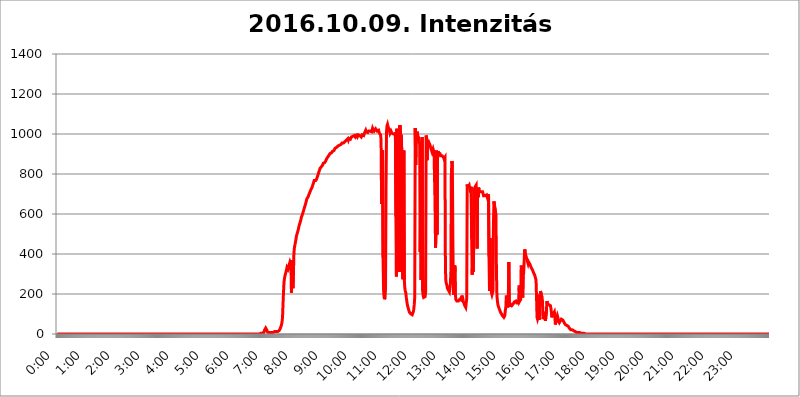
| Category | 2016.10.09. Intenzitás [W/m^2] |
|---|---|
| 0.0 | 0 |
| 0.0006944444444444445 | 0 |
| 0.001388888888888889 | 0 |
| 0.0020833333333333333 | 0 |
| 0.002777777777777778 | 0 |
| 0.003472222222222222 | 0 |
| 0.004166666666666667 | 0 |
| 0.004861111111111111 | 0 |
| 0.005555555555555556 | 0 |
| 0.0062499999999999995 | 0 |
| 0.006944444444444444 | 0 |
| 0.007638888888888889 | 0 |
| 0.008333333333333333 | 0 |
| 0.009027777777777779 | 0 |
| 0.009722222222222222 | 0 |
| 0.010416666666666666 | 0 |
| 0.011111111111111112 | 0 |
| 0.011805555555555555 | 0 |
| 0.012499999999999999 | 0 |
| 0.013194444444444444 | 0 |
| 0.013888888888888888 | 0 |
| 0.014583333333333332 | 0 |
| 0.015277777777777777 | 0 |
| 0.015972222222222224 | 0 |
| 0.016666666666666666 | 0 |
| 0.017361111111111112 | 0 |
| 0.018055555555555557 | 0 |
| 0.01875 | 0 |
| 0.019444444444444445 | 0 |
| 0.02013888888888889 | 0 |
| 0.020833333333333332 | 0 |
| 0.02152777777777778 | 0 |
| 0.022222222222222223 | 0 |
| 0.02291666666666667 | 0 |
| 0.02361111111111111 | 0 |
| 0.024305555555555556 | 0 |
| 0.024999999999999998 | 0 |
| 0.025694444444444447 | 0 |
| 0.02638888888888889 | 0 |
| 0.027083333333333334 | 0 |
| 0.027777777777777776 | 0 |
| 0.02847222222222222 | 0 |
| 0.029166666666666664 | 0 |
| 0.029861111111111113 | 0 |
| 0.030555555555555555 | 0 |
| 0.03125 | 0 |
| 0.03194444444444445 | 0 |
| 0.03263888888888889 | 0 |
| 0.03333333333333333 | 0 |
| 0.034027777777777775 | 0 |
| 0.034722222222222224 | 0 |
| 0.035416666666666666 | 0 |
| 0.036111111111111115 | 0 |
| 0.03680555555555556 | 0 |
| 0.0375 | 0 |
| 0.03819444444444444 | 0 |
| 0.03888888888888889 | 0 |
| 0.03958333333333333 | 0 |
| 0.04027777777777778 | 0 |
| 0.04097222222222222 | 0 |
| 0.041666666666666664 | 0 |
| 0.042361111111111106 | 0 |
| 0.04305555555555556 | 0 |
| 0.043750000000000004 | 0 |
| 0.044444444444444446 | 0 |
| 0.04513888888888889 | 0 |
| 0.04583333333333334 | 0 |
| 0.04652777777777778 | 0 |
| 0.04722222222222222 | 0 |
| 0.04791666666666666 | 0 |
| 0.04861111111111111 | 0 |
| 0.049305555555555554 | 0 |
| 0.049999999999999996 | 0 |
| 0.05069444444444445 | 0 |
| 0.051388888888888894 | 0 |
| 0.052083333333333336 | 0 |
| 0.05277777777777778 | 0 |
| 0.05347222222222222 | 0 |
| 0.05416666666666667 | 0 |
| 0.05486111111111111 | 0 |
| 0.05555555555555555 | 0 |
| 0.05625 | 0 |
| 0.05694444444444444 | 0 |
| 0.057638888888888885 | 0 |
| 0.05833333333333333 | 0 |
| 0.05902777777777778 | 0 |
| 0.059722222222222225 | 0 |
| 0.06041666666666667 | 0 |
| 0.061111111111111116 | 0 |
| 0.06180555555555556 | 0 |
| 0.0625 | 0 |
| 0.06319444444444444 | 0 |
| 0.06388888888888888 | 0 |
| 0.06458333333333334 | 0 |
| 0.06527777777777778 | 0 |
| 0.06597222222222222 | 0 |
| 0.06666666666666667 | 0 |
| 0.06736111111111111 | 0 |
| 0.06805555555555555 | 0 |
| 0.06874999999999999 | 0 |
| 0.06944444444444443 | 0 |
| 0.07013888888888889 | 0 |
| 0.07083333333333333 | 0 |
| 0.07152777777777779 | 0 |
| 0.07222222222222223 | 0 |
| 0.07291666666666667 | 0 |
| 0.07361111111111111 | 0 |
| 0.07430555555555556 | 0 |
| 0.075 | 0 |
| 0.07569444444444444 | 0 |
| 0.0763888888888889 | 0 |
| 0.07708333333333334 | 0 |
| 0.07777777777777778 | 0 |
| 0.07847222222222222 | 0 |
| 0.07916666666666666 | 0 |
| 0.0798611111111111 | 0 |
| 0.08055555555555556 | 0 |
| 0.08125 | 0 |
| 0.08194444444444444 | 0 |
| 0.08263888888888889 | 0 |
| 0.08333333333333333 | 0 |
| 0.08402777777777777 | 0 |
| 0.08472222222222221 | 0 |
| 0.08541666666666665 | 0 |
| 0.08611111111111112 | 0 |
| 0.08680555555555557 | 0 |
| 0.08750000000000001 | 0 |
| 0.08819444444444445 | 0 |
| 0.08888888888888889 | 0 |
| 0.08958333333333333 | 0 |
| 0.09027777777777778 | 0 |
| 0.09097222222222222 | 0 |
| 0.09166666666666667 | 0 |
| 0.09236111111111112 | 0 |
| 0.09305555555555556 | 0 |
| 0.09375 | 0 |
| 0.09444444444444444 | 0 |
| 0.09513888888888888 | 0 |
| 0.09583333333333333 | 0 |
| 0.09652777777777777 | 0 |
| 0.09722222222222222 | 0 |
| 0.09791666666666667 | 0 |
| 0.09861111111111111 | 0 |
| 0.09930555555555555 | 0 |
| 0.09999999999999999 | 0 |
| 0.10069444444444443 | 0 |
| 0.1013888888888889 | 0 |
| 0.10208333333333335 | 0 |
| 0.10277777777777779 | 0 |
| 0.10347222222222223 | 0 |
| 0.10416666666666667 | 0 |
| 0.10486111111111111 | 0 |
| 0.10555555555555556 | 0 |
| 0.10625 | 0 |
| 0.10694444444444444 | 0 |
| 0.1076388888888889 | 0 |
| 0.10833333333333334 | 0 |
| 0.10902777777777778 | 0 |
| 0.10972222222222222 | 0 |
| 0.1111111111111111 | 0 |
| 0.11180555555555556 | 0 |
| 0.11180555555555556 | 0 |
| 0.1125 | 0 |
| 0.11319444444444444 | 0 |
| 0.11388888888888889 | 0 |
| 0.11458333333333333 | 0 |
| 0.11527777777777777 | 0 |
| 0.11597222222222221 | 0 |
| 0.11666666666666665 | 0 |
| 0.1173611111111111 | 0 |
| 0.11805555555555557 | 0 |
| 0.11944444444444445 | 0 |
| 0.12013888888888889 | 0 |
| 0.12083333333333333 | 0 |
| 0.12152777777777778 | 0 |
| 0.12222222222222223 | 0 |
| 0.12291666666666667 | 0 |
| 0.12291666666666667 | 0 |
| 0.12361111111111112 | 0 |
| 0.12430555555555556 | 0 |
| 0.125 | 0 |
| 0.12569444444444444 | 0 |
| 0.12638888888888888 | 0 |
| 0.12708333333333333 | 0 |
| 0.16875 | 0 |
| 0.12847222222222224 | 0 |
| 0.12916666666666668 | 0 |
| 0.12986111111111112 | 0 |
| 0.13055555555555556 | 0 |
| 0.13125 | 0 |
| 0.13194444444444445 | 0 |
| 0.1326388888888889 | 0 |
| 0.13333333333333333 | 0 |
| 0.13402777777777777 | 0 |
| 0.13402777777777777 | 0 |
| 0.13472222222222222 | 0 |
| 0.13541666666666666 | 0 |
| 0.1361111111111111 | 0 |
| 0.13749999999999998 | 0 |
| 0.13819444444444443 | 0 |
| 0.1388888888888889 | 0 |
| 0.13958333333333334 | 0 |
| 0.14027777777777778 | 0 |
| 0.14097222222222222 | 0 |
| 0.14166666666666666 | 0 |
| 0.1423611111111111 | 0 |
| 0.14305555555555557 | 0 |
| 0.14375000000000002 | 0 |
| 0.14444444444444446 | 0 |
| 0.1451388888888889 | 0 |
| 0.1451388888888889 | 0 |
| 0.14652777777777778 | 0 |
| 0.14722222222222223 | 0 |
| 0.14791666666666667 | 0 |
| 0.1486111111111111 | 0 |
| 0.14930555555555555 | 0 |
| 0.15 | 0 |
| 0.15069444444444444 | 0 |
| 0.15138888888888888 | 0 |
| 0.15208333333333332 | 0 |
| 0.15277777777777776 | 0 |
| 0.15347222222222223 | 0 |
| 0.15416666666666667 | 0 |
| 0.15486111111111112 | 0 |
| 0.15555555555555556 | 0 |
| 0.15625 | 0 |
| 0.15694444444444444 | 0 |
| 0.15763888888888888 | 0 |
| 0.15833333333333333 | 0 |
| 0.15902777777777777 | 0 |
| 0.15972222222222224 | 0 |
| 0.16041666666666668 | 0 |
| 0.16111111111111112 | 0 |
| 0.16180555555555556 | 0 |
| 0.1625 | 0 |
| 0.16319444444444445 | 0 |
| 0.1638888888888889 | 0 |
| 0.16458333333333333 | 0 |
| 0.16527777777777777 | 0 |
| 0.16597222222222222 | 0 |
| 0.16666666666666666 | 0 |
| 0.1673611111111111 | 0 |
| 0.16805555555555554 | 0 |
| 0.16874999999999998 | 0 |
| 0.16944444444444443 | 0 |
| 0.17013888888888887 | 0 |
| 0.1708333333333333 | 0 |
| 0.17152777777777775 | 0 |
| 0.17222222222222225 | 0 |
| 0.1729166666666667 | 0 |
| 0.17361111111111113 | 0 |
| 0.17430555555555557 | 0 |
| 0.17500000000000002 | 0 |
| 0.17569444444444446 | 0 |
| 0.1763888888888889 | 0 |
| 0.17708333333333334 | 0 |
| 0.17777777777777778 | 0 |
| 0.17847222222222223 | 0 |
| 0.17916666666666667 | 0 |
| 0.1798611111111111 | 0 |
| 0.18055555555555555 | 0 |
| 0.18125 | 0 |
| 0.18194444444444444 | 0 |
| 0.1826388888888889 | 0 |
| 0.18333333333333335 | 0 |
| 0.1840277777777778 | 0 |
| 0.18472222222222223 | 0 |
| 0.18541666666666667 | 0 |
| 0.18611111111111112 | 0 |
| 0.18680555555555556 | 0 |
| 0.1875 | 0 |
| 0.18819444444444444 | 0 |
| 0.18888888888888888 | 0 |
| 0.18958333333333333 | 0 |
| 0.19027777777777777 | 0 |
| 0.1909722222222222 | 0 |
| 0.19166666666666665 | 0 |
| 0.19236111111111112 | 0 |
| 0.19305555555555554 | 0 |
| 0.19375 | 0 |
| 0.19444444444444445 | 0 |
| 0.1951388888888889 | 0 |
| 0.19583333333333333 | 0 |
| 0.19652777777777777 | 0 |
| 0.19722222222222222 | 0 |
| 0.19791666666666666 | 0 |
| 0.1986111111111111 | 0 |
| 0.19930555555555554 | 0 |
| 0.19999999999999998 | 0 |
| 0.20069444444444443 | 0 |
| 0.20138888888888887 | 0 |
| 0.2020833333333333 | 0 |
| 0.2027777777777778 | 0 |
| 0.2034722222222222 | 0 |
| 0.2041666666666667 | 0 |
| 0.20486111111111113 | 0 |
| 0.20555555555555557 | 0 |
| 0.20625000000000002 | 0 |
| 0.20694444444444446 | 0 |
| 0.2076388888888889 | 0 |
| 0.20833333333333334 | 0 |
| 0.20902777777777778 | 0 |
| 0.20972222222222223 | 0 |
| 0.21041666666666667 | 0 |
| 0.2111111111111111 | 0 |
| 0.21180555555555555 | 0 |
| 0.2125 | 0 |
| 0.21319444444444444 | 0 |
| 0.2138888888888889 | 0 |
| 0.21458333333333335 | 0 |
| 0.2152777777777778 | 0 |
| 0.21597222222222223 | 0 |
| 0.21666666666666667 | 0 |
| 0.21736111111111112 | 0 |
| 0.21805555555555556 | 0 |
| 0.21875 | 0 |
| 0.21944444444444444 | 0 |
| 0.22013888888888888 | 0 |
| 0.22083333333333333 | 0 |
| 0.22152777777777777 | 0 |
| 0.2222222222222222 | 0 |
| 0.22291666666666665 | 0 |
| 0.2236111111111111 | 0 |
| 0.22430555555555556 | 0 |
| 0.225 | 0 |
| 0.22569444444444445 | 0 |
| 0.2263888888888889 | 0 |
| 0.22708333333333333 | 0 |
| 0.22777777777777777 | 0 |
| 0.22847222222222222 | 0 |
| 0.22916666666666666 | 0 |
| 0.2298611111111111 | 0 |
| 0.23055555555555554 | 0 |
| 0.23124999999999998 | 0 |
| 0.23194444444444443 | 0 |
| 0.23263888888888887 | 0 |
| 0.2333333333333333 | 0 |
| 0.2340277777777778 | 0 |
| 0.2347222222222222 | 0 |
| 0.2354166666666667 | 0 |
| 0.23611111111111113 | 0 |
| 0.23680555555555557 | 0 |
| 0.23750000000000002 | 0 |
| 0.23819444444444446 | 0 |
| 0.2388888888888889 | 0 |
| 0.23958333333333334 | 0 |
| 0.24027777777777778 | 0 |
| 0.24097222222222223 | 0 |
| 0.24166666666666667 | 0 |
| 0.2423611111111111 | 0 |
| 0.24305555555555555 | 0 |
| 0.24375 | 0 |
| 0.24444444444444446 | 0 |
| 0.24513888888888888 | 0 |
| 0.24583333333333335 | 0 |
| 0.2465277777777778 | 0 |
| 0.24722222222222223 | 0 |
| 0.24791666666666667 | 0 |
| 0.24861111111111112 | 0 |
| 0.24930555555555556 | 0 |
| 0.25 | 0 |
| 0.25069444444444444 | 0 |
| 0.2513888888888889 | 0 |
| 0.2520833333333333 | 0 |
| 0.25277777777777777 | 0 |
| 0.2534722222222222 | 0 |
| 0.25416666666666665 | 0 |
| 0.2548611111111111 | 0 |
| 0.2555555555555556 | 0 |
| 0.25625000000000003 | 0 |
| 0.2569444444444445 | 0 |
| 0.2576388888888889 | 0 |
| 0.25833333333333336 | 0 |
| 0.2590277777777778 | 0 |
| 0.25972222222222224 | 0 |
| 0.2604166666666667 | 0 |
| 0.2611111111111111 | 0 |
| 0.26180555555555557 | 0 |
| 0.2625 | 0 |
| 0.26319444444444445 | 0 |
| 0.2638888888888889 | 0 |
| 0.26458333333333334 | 0 |
| 0.2652777777777778 | 0 |
| 0.2659722222222222 | 0 |
| 0.26666666666666666 | 0 |
| 0.2673611111111111 | 0 |
| 0.26805555555555555 | 0 |
| 0.26875 | 0 |
| 0.26944444444444443 | 0 |
| 0.2701388888888889 | 0 |
| 0.2708333333333333 | 0 |
| 0.27152777777777776 | 0 |
| 0.2722222222222222 | 0 |
| 0.27291666666666664 | 0 |
| 0.2736111111111111 | 0 |
| 0.2743055555555555 | 0 |
| 0.27499999999999997 | 0 |
| 0.27569444444444446 | 0 |
| 0.27638888888888885 | 0 |
| 0.27708333333333335 | 0 |
| 0.2777777777777778 | 0 |
| 0.27847222222222223 | 0 |
| 0.2791666666666667 | 0 |
| 0.2798611111111111 | 0 |
| 0.28055555555555556 | 0 |
| 0.28125 | 0 |
| 0.28194444444444444 | 0 |
| 0.2826388888888889 | 0 |
| 0.2833333333333333 | 0 |
| 0.28402777777777777 | 0 |
| 0.2847222222222222 | 3.525 |
| 0.28541666666666665 | 3.525 |
| 0.28611111111111115 | 3.525 |
| 0.28680555555555554 | 3.525 |
| 0.28750000000000003 | 3.525 |
| 0.2881944444444445 | 3.525 |
| 0.2888888888888889 | 7.887 |
| 0.28958333333333336 | 7.887 |
| 0.2902777777777778 | 12.257 |
| 0.29097222222222224 | 21.024 |
| 0.2916666666666667 | 25.419 |
| 0.2923611111111111 | 29.823 |
| 0.29305555555555557 | 29.823 |
| 0.29375 | 21.024 |
| 0.29444444444444445 | 12.257 |
| 0.2951388888888889 | 7.887 |
| 0.29583333333333334 | 7.887 |
| 0.2965277777777778 | 7.887 |
| 0.2972222222222222 | 7.887 |
| 0.29791666666666666 | 7.887 |
| 0.2986111111111111 | 7.887 |
| 0.29930555555555555 | 7.887 |
| 0.3 | 7.887 |
| 0.30069444444444443 | 7.887 |
| 0.3013888888888889 | 7.887 |
| 0.3020833333333333 | 7.887 |
| 0.30277777777777776 | 7.887 |
| 0.3034722222222222 | 12.257 |
| 0.30416666666666664 | 12.257 |
| 0.3048611111111111 | 12.257 |
| 0.3055555555555555 | 12.257 |
| 0.30624999999999997 | 12.257 |
| 0.3069444444444444 | 12.257 |
| 0.3076388888888889 | 12.257 |
| 0.30833333333333335 | 12.257 |
| 0.3090277777777778 | 12.257 |
| 0.30972222222222223 | 16.636 |
| 0.3104166666666667 | 16.636 |
| 0.3111111111111111 | 16.636 |
| 0.31180555555555556 | 21.024 |
| 0.3125 | 25.419 |
| 0.31319444444444444 | 29.823 |
| 0.3138888888888889 | 38.653 |
| 0.3145833333333333 | 47.511 |
| 0.31527777777777777 | 60.85 |
| 0.3159722222222222 | 83.205 |
| 0.31666666666666665 | 150.964 |
| 0.31736111111111115 | 210.182 |
| 0.31805555555555554 | 260.373 |
| 0.31875000000000003 | 278.603 |
| 0.3194444444444445 | 292.259 |
| 0.3201388888888889 | 296.808 |
| 0.32083333333333336 | 310.44 |
| 0.3215277777777778 | 314.98 |
| 0.32222222222222224 | 333.113 |
| 0.3229166666666667 | 333.113 |
| 0.3236111111111111 | 324.052 |
| 0.32430555555555557 | 324.052 |
| 0.325 | 342.162 |
| 0.32569444444444445 | 351.198 |
| 0.3263888888888889 | 360.221 |
| 0.32708333333333334 | 364.728 |
| 0.3277777777777778 | 346.682 |
| 0.3284722222222222 | 205.62 |
| 0.32916666666666666 | 369.23 |
| 0.3298611111111111 | 274.047 |
| 0.33055555555555555 | 228.436 |
| 0.33125 | 301.354 |
| 0.33194444444444443 | 405.108 |
| 0.3326388888888889 | 431.833 |
| 0.3333333333333333 | 445.129 |
| 0.3340277777777778 | 458.38 |
| 0.3347222222222222 | 471.582 |
| 0.3354166666666667 | 489.108 |
| 0.3361111111111111 | 497.836 |
| 0.3368055555555556 | 502.192 |
| 0.33749999999999997 | 515.223 |
| 0.33819444444444446 | 523.88 |
| 0.33888888888888885 | 536.82 |
| 0.33958333333333335 | 541.121 |
| 0.34027777777777773 | 553.986 |
| 0.34097222222222223 | 562.53 |
| 0.3416666666666666 | 571.049 |
| 0.3423611111111111 | 583.779 |
| 0.3430555555555555 | 588.009 |
| 0.34375 | 596.45 |
| 0.3444444444444445 | 604.864 |
| 0.3451388888888889 | 613.252 |
| 0.3458333333333334 | 621.613 |
| 0.34652777777777777 | 629.948 |
| 0.34722222222222227 | 638.256 |
| 0.34791666666666665 | 642.4 |
| 0.34861111111111115 | 654.791 |
| 0.34930555555555554 | 658.909 |
| 0.35000000000000003 | 675.311 |
| 0.3506944444444444 | 671.22 |
| 0.3513888888888889 | 679.395 |
| 0.3520833333333333 | 687.544 |
| 0.3527777777777778 | 695.666 |
| 0.3534722222222222 | 699.717 |
| 0.3541666666666667 | 707.8 |
| 0.3548611111111111 | 711.832 |
| 0.35555555555555557 | 719.877 |
| 0.35625 | 719.877 |
| 0.35694444444444445 | 723.889 |
| 0.3576388888888889 | 735.89 |
| 0.35833333333333334 | 743.859 |
| 0.3590277777777778 | 751.803 |
| 0.3597222222222222 | 759.723 |
| 0.36041666666666666 | 767.62 |
| 0.3611111111111111 | 763.674 |
| 0.36180555555555555 | 771.559 |
| 0.3625 | 767.62 |
| 0.36319444444444443 | 771.559 |
| 0.3638888888888889 | 775.492 |
| 0.3645833333333333 | 783.342 |
| 0.3652777777777778 | 791.169 |
| 0.3659722222222222 | 798.974 |
| 0.3666666666666667 | 806.757 |
| 0.3673611111111111 | 814.519 |
| 0.3680555555555556 | 822.26 |
| 0.36874999999999997 | 829.981 |
| 0.36944444444444446 | 829.981 |
| 0.37013888888888885 | 833.834 |
| 0.37083333333333335 | 837.682 |
| 0.37152777777777773 | 841.526 |
| 0.37222222222222223 | 845.365 |
| 0.3729166666666666 | 853.029 |
| 0.3736111111111111 | 853.029 |
| 0.3743055555555555 | 856.855 |
| 0.375 | 856.855 |
| 0.3756944444444445 | 860.676 |
| 0.3763888888888889 | 864.493 |
| 0.3770833333333334 | 864.493 |
| 0.37777777777777777 | 875.918 |
| 0.37847222222222227 | 879.719 |
| 0.37916666666666665 | 883.516 |
| 0.37986111111111115 | 883.516 |
| 0.38055555555555554 | 891.099 |
| 0.38125000000000003 | 891.099 |
| 0.3819444444444444 | 894.885 |
| 0.3826388888888889 | 902.447 |
| 0.3833333333333333 | 902.447 |
| 0.3840277777777778 | 902.447 |
| 0.3847222222222222 | 906.223 |
| 0.3854166666666667 | 909.996 |
| 0.3861111111111111 | 913.766 |
| 0.38680555555555557 | 913.766 |
| 0.3875 | 913.766 |
| 0.38819444444444445 | 917.534 |
| 0.3888888888888889 | 921.298 |
| 0.38958333333333334 | 928.819 |
| 0.3902777777777778 | 932.576 |
| 0.3909722222222222 | 928.819 |
| 0.39166666666666666 | 932.576 |
| 0.3923611111111111 | 932.576 |
| 0.39305555555555555 | 936.33 |
| 0.39375 | 940.082 |
| 0.39444444444444443 | 940.082 |
| 0.3951388888888889 | 940.082 |
| 0.3958333333333333 | 943.832 |
| 0.3965277777777778 | 947.58 |
| 0.3972222222222222 | 947.58 |
| 0.3979166666666667 | 947.58 |
| 0.3986111111111111 | 951.327 |
| 0.3993055555555556 | 955.071 |
| 0.39999999999999997 | 955.071 |
| 0.40069444444444446 | 955.071 |
| 0.40138888888888885 | 955.071 |
| 0.40208333333333335 | 955.071 |
| 0.40277777777777773 | 958.814 |
| 0.40347222222222223 | 962.555 |
| 0.4041666666666666 | 962.555 |
| 0.4048611111111111 | 966.295 |
| 0.4055555555555555 | 970.034 |
| 0.40625 | 970.034 |
| 0.4069444444444445 | 973.772 |
| 0.4076388888888889 | 977.508 |
| 0.4083333333333334 | 970.034 |
| 0.40902777777777777 | 977.508 |
| 0.40972222222222227 | 977.508 |
| 0.41041666666666665 | 977.508 |
| 0.41111111111111115 | 973.772 |
| 0.41180555555555554 | 977.508 |
| 0.41250000000000003 | 984.98 |
| 0.4131944444444444 | 984.98 |
| 0.4138888888888889 | 988.714 |
| 0.4145833333333333 | 988.714 |
| 0.4152777777777778 | 988.714 |
| 0.4159722222222222 | 992.448 |
| 0.4166666666666667 | 992.448 |
| 0.4173611111111111 | 992.448 |
| 0.41805555555555557 | 984.98 |
| 0.41875 | 984.98 |
| 0.41944444444444445 | 992.448 |
| 0.4201388888888889 | 988.714 |
| 0.42083333333333334 | 984.98 |
| 0.4215277777777778 | 984.98 |
| 0.4222222222222222 | 996.182 |
| 0.42291666666666666 | 992.448 |
| 0.4236111111111111 | 992.448 |
| 0.42430555555555555 | 992.448 |
| 0.425 | 992.448 |
| 0.42569444444444443 | 992.448 |
| 0.4263888888888889 | 984.98 |
| 0.4270833333333333 | 984.98 |
| 0.4277777777777778 | 996.182 |
| 0.4284722222222222 | 992.448 |
| 0.4291666666666667 | 992.448 |
| 0.4298611111111111 | 992.448 |
| 0.4305555555555556 | 996.182 |
| 0.43124999999999997 | 1007.383 |
| 0.43194444444444446 | 1011.118 |
| 0.43263888888888885 | 1018.587 |
| 0.43333333333333335 | 1011.118 |
| 0.43402777777777773 | 1014.852 |
| 0.43472222222222223 | 1014.852 |
| 0.4354166666666666 | 1007.383 |
| 0.4361111111111111 | 1007.383 |
| 0.4368055555555555 | 1014.852 |
| 0.4375 | 1011.118 |
| 0.4381944444444445 | 1014.852 |
| 0.4388888888888889 | 1014.852 |
| 0.4395833333333334 | 1014.852 |
| 0.44027777777777777 | 1018.587 |
| 0.44097222222222227 | 1011.118 |
| 0.44166666666666665 | 1018.587 |
| 0.44236111111111115 | 1029.798 |
| 0.44305555555555554 | 1029.798 |
| 0.44375000000000003 | 1026.06 |
| 0.4444444444444444 | 1014.852 |
| 0.4451388888888889 | 1011.118 |
| 0.4458333333333333 | 1014.852 |
| 0.4465277777777778 | 1026.06 |
| 0.4472222222222222 | 1026.06 |
| 0.4479166666666667 | 1022.323 |
| 0.4486111111111111 | 1014.852 |
| 0.44930555555555557 | 1011.118 |
| 0.45 | 1014.852 |
| 0.45069444444444445 | 1018.587 |
| 0.4513888888888889 | 1007.383 |
| 0.45208333333333334 | 1007.383 |
| 0.4527777777777778 | 1007.383 |
| 0.4534722222222222 | 996.182 |
| 0.45416666666666666 | 970.034 |
| 0.4548611111111111 | 650.667 |
| 0.45555555555555555 | 650.667 |
| 0.45625 | 917.534 |
| 0.45694444444444443 | 382.715 |
| 0.4576388888888889 | 223.873 |
| 0.4583333333333333 | 187.378 |
| 0.4590277777777778 | 173.709 |
| 0.4597222222222222 | 182.82 |
| 0.4604166666666667 | 228.436 |
| 0.4611111111111111 | 735.89 |
| 0.4618055555555556 | 1011.118 |
| 0.46249999999999997 | 1041.019 |
| 0.46319444444444446 | 1048.508 |
| 0.46388888888888885 | 1037.277 |
| 0.46458333333333335 | 1029.798 |
| 0.46527777777777773 | 1026.06 |
| 0.46597222222222223 | 1014.852 |
| 0.4666666666666666 | 1003.65 |
| 0.4673611111111111 | 1007.383 |
| 0.4680555555555555 | 1014.852 |
| 0.46875 | 1011.118 |
| 0.4694444444444445 | 1003.65 |
| 0.4701388888888889 | 1003.65 |
| 0.4708333333333334 | 1003.65 |
| 0.47152777777777777 | 999.916 |
| 0.47222222222222227 | 1003.65 |
| 0.47291666666666665 | 999.916 |
| 0.47361111111111115 | 999.916 |
| 0.47430555555555554 | 1007.383 |
| 0.47500000000000003 | 588.009 |
| 0.4756944444444444 | 287.709 |
| 0.4763888888888889 | 1026.06 |
| 0.4770833333333333 | 471.582 |
| 0.4777777777777778 | 342.162 |
| 0.4784722222222222 | 328.584 |
| 0.4791666666666667 | 324.052 |
| 0.4798611111111111 | 310.44 |
| 0.48055555555555557 | 1044.762 |
| 0.48125 | 1048.508 |
| 0.48194444444444445 | 977.508 |
| 0.4826388888888889 | 996.182 |
| 0.48333333333333334 | 875.918 |
| 0.4840277777777778 | 314.98 |
| 0.4847222222222222 | 274.047 |
| 0.48541666666666666 | 497.836 |
| 0.4861111111111111 | 917.534 |
| 0.48680555555555555 | 269.49 |
| 0.4875 | 228.436 |
| 0.48819444444444443 | 214.746 |
| 0.4888888888888889 | 205.62 |
| 0.4895833333333333 | 182.82 |
| 0.4902777777777778 | 164.605 |
| 0.4909722222222222 | 146.423 |
| 0.4916666666666667 | 137.347 |
| 0.4923611111111111 | 128.284 |
| 0.4930555555555556 | 119.235 |
| 0.49374999999999997 | 110.201 |
| 0.49444444444444446 | 110.201 |
| 0.49513888888888885 | 105.69 |
| 0.49583333333333335 | 101.184 |
| 0.49652777777777773 | 96.682 |
| 0.49722222222222223 | 96.682 |
| 0.4979166666666666 | 96.682 |
| 0.4986111111111111 | 101.184 |
| 0.4993055555555555 | 110.201 |
| 0.5 | 123.758 |
| 0.5006944444444444 | 146.423 |
| 0.5013888888888889 | 182.82 |
| 0.5020833333333333 | 1029.798 |
| 0.5027777777777778 | 845.365 |
| 0.5034722222222222 | 977.508 |
| 0.5041666666666667 | 966.295 |
| 0.5048611111111111 | 1011.118 |
| 0.5055555555555555 | 992.448 |
| 0.50625 | 988.714 |
| 0.5069444444444444 | 981.244 |
| 0.5076388888888889 | 981.244 |
| 0.5083333333333333 | 947.58 |
| 0.5090277777777777 | 409.574 |
| 0.5097222222222222 | 683.473 |
| 0.5104166666666666 | 269.49 |
| 0.5111111111111112 | 471.582 |
| 0.5118055555555555 | 984.98 |
| 0.5125000000000001 | 214.746 |
| 0.5131944444444444 | 191.937 |
| 0.513888888888889 | 182.82 |
| 0.5145833333333333 | 182.82 |
| 0.5152777777777778 | 182.82 |
| 0.5159722222222222 | 187.378 |
| 0.5166666666666667 | 210.182 |
| 0.517361111111111 | 992.448 |
| 0.5180555555555556 | 981.244 |
| 0.5187499999999999 | 868.305 |
| 0.5194444444444445 | 970.034 |
| 0.5201388888888888 | 955.071 |
| 0.5208333333333334 | 947.58 |
| 0.5215277777777778 | 955.071 |
| 0.5222222222222223 | 951.327 |
| 0.5229166666666667 | 943.832 |
| 0.5236111111111111 | 932.576 |
| 0.5243055555555556 | 925.06 |
| 0.525 | 917.534 |
| 0.5256944444444445 | 909.996 |
| 0.5263888888888889 | 917.534 |
| 0.5270833333333333 | 925.06 |
| 0.5277777777777778 | 921.298 |
| 0.5284722222222222 | 906.223 |
| 0.5291666666666667 | 909.996 |
| 0.5298611111111111 | 654.791 |
| 0.5305555555555556 | 431.833 |
| 0.53125 | 519.555 |
| 0.5319444444444444 | 917.534 |
| 0.5326388888888889 | 497.836 |
| 0.5333333333333333 | 894.885 |
| 0.5340277777777778 | 913.766 |
| 0.5347222222222222 | 906.223 |
| 0.5354166666666667 | 909.996 |
| 0.5361111111111111 | 906.223 |
| 0.5368055555555555 | 902.447 |
| 0.5375 | 891.099 |
| 0.5381944444444444 | 891.099 |
| 0.5388888888888889 | 891.099 |
| 0.5395833333333333 | 891.099 |
| 0.5402777777777777 | 891.099 |
| 0.5409722222222222 | 887.309 |
| 0.5416666666666666 | 883.516 |
| 0.5423611111111112 | 875.918 |
| 0.5430555555555555 | 875.918 |
| 0.5437500000000001 | 883.516 |
| 0.5444444444444444 | 324.052 |
| 0.545138888888889 | 260.373 |
| 0.5458333333333333 | 251.251 |
| 0.5465277777777778 | 242.127 |
| 0.5472222222222222 | 228.436 |
| 0.5479166666666667 | 223.873 |
| 0.548611111111111 | 219.309 |
| 0.5493055555555556 | 219.309 |
| 0.5499999999999999 | 210.182 |
| 0.5506944444444445 | 214.746 |
| 0.5513888888888888 | 251.251 |
| 0.5520833333333334 | 310.44 |
| 0.5527777777777778 | 795.074 |
| 0.5534722222222223 | 864.493 |
| 0.5541666666666667 | 853.029 |
| 0.5548611111111111 | 475.972 |
| 0.5555555555555556 | 214.746 |
| 0.55625 | 196.497 |
| 0.5569444444444445 | 191.937 |
| 0.5576388888888889 | 342.162 |
| 0.5583333333333333 | 201.058 |
| 0.5590277777777778 | 173.709 |
| 0.5597222222222222 | 169.156 |
| 0.5604166666666667 | 164.605 |
| 0.5611111111111111 | 160.056 |
| 0.5618055555555556 | 164.605 |
| 0.5625 | 164.605 |
| 0.5631944444444444 | 169.156 |
| 0.5638888888888889 | 169.156 |
| 0.5645833333333333 | 173.709 |
| 0.5652777777777778 | 178.264 |
| 0.5659722222222222 | 173.709 |
| 0.5666666666666667 | 169.156 |
| 0.5673611111111111 | 191.937 |
| 0.5680555555555555 | 191.937 |
| 0.56875 | 178.264 |
| 0.5694444444444444 | 164.605 |
| 0.5701388888888889 | 155.509 |
| 0.5708333333333333 | 150.964 |
| 0.5715277777777777 | 141.884 |
| 0.5722222222222222 | 137.347 |
| 0.5729166666666666 | 132.814 |
| 0.5736111111111112 | 132.814 |
| 0.5743055555555555 | 178.264 |
| 0.5750000000000001 | 747.834 |
| 0.5756944444444444 | 727.896 |
| 0.576388888888889 | 735.89 |
| 0.5770833333333333 | 735.89 |
| 0.5777777777777778 | 743.859 |
| 0.5784722222222222 | 743.859 |
| 0.5791666666666667 | 743.859 |
| 0.579861111111111 | 707.8 |
| 0.5805555555555556 | 735.89 |
| 0.5812499999999999 | 475.972 |
| 0.5819444444444445 | 296.808 |
| 0.5826388888888888 | 369.23 |
| 0.5833333333333334 | 310.44 |
| 0.5840277777777778 | 427.39 |
| 0.5847222222222223 | 727.896 |
| 0.5854166666666667 | 711.832 |
| 0.5861111111111111 | 735.89 |
| 0.5868055555555556 | 735.89 |
| 0.5875 | 743.859 |
| 0.5881944444444445 | 743.859 |
| 0.5888888888888889 | 427.39 |
| 0.5895833333333333 | 727.896 |
| 0.5902777777777778 | 683.473 |
| 0.5909722222222222 | 731.896 |
| 0.5916666666666667 | 723.889 |
| 0.5923611111111111 | 711.832 |
| 0.5930555555555556 | 715.858 |
| 0.59375 | 715.858 |
| 0.5944444444444444 | 711.832 |
| 0.5951388888888889 | 711.832 |
| 0.5958333333333333 | 711.832 |
| 0.5965277777777778 | 711.832 |
| 0.5972222222222222 | 707.8 |
| 0.5979166666666667 | 691.608 |
| 0.5986111111111111 | 687.544 |
| 0.5993055555555555 | 691.608 |
| 0.6 | 691.608 |
| 0.6006944444444444 | 695.666 |
| 0.6013888888888889 | 695.666 |
| 0.6020833333333333 | 695.666 |
| 0.6027777777777777 | 687.544 |
| 0.6034722222222222 | 679.395 |
| 0.6041666666666666 | 683.473 |
| 0.6048611111111112 | 699.717 |
| 0.6055555555555555 | 387.202 |
| 0.6062500000000001 | 214.746 |
| 0.6069444444444444 | 480.356 |
| 0.607638888888889 | 255.813 |
| 0.6083333333333333 | 342.162 |
| 0.6090277777777778 | 205.62 |
| 0.6097222222222222 | 196.497 |
| 0.6104166666666667 | 196.497 |
| 0.611111111111111 | 214.746 |
| 0.6118055555555556 | 558.261 |
| 0.6124999999999999 | 663.019 |
| 0.6131944444444445 | 667.123 |
| 0.6138888888888888 | 663.019 |
| 0.6145833333333334 | 609.062 |
| 0.6152777777777778 | 600.661 |
| 0.6159722222222223 | 314.98 |
| 0.6166666666666667 | 191.937 |
| 0.6173611111111111 | 164.605 |
| 0.6180555555555556 | 146.423 |
| 0.61875 | 137.347 |
| 0.6194444444444445 | 132.814 |
| 0.6201388888888889 | 123.758 |
| 0.6208333333333333 | 119.235 |
| 0.6215277777777778 | 110.201 |
| 0.6222222222222222 | 105.69 |
| 0.6229166666666667 | 101.184 |
| 0.6236111111111111 | 96.682 |
| 0.6243055555555556 | 92.184 |
| 0.625 | 87.692 |
| 0.6256944444444444 | 87.692 |
| 0.6263888888888889 | 83.205 |
| 0.6270833333333333 | 83.205 |
| 0.6277777777777778 | 92.184 |
| 0.6284722222222222 | 119.235 |
| 0.6291666666666667 | 132.814 |
| 0.6298611111111111 | 191.937 |
| 0.6305555555555555 | 196.497 |
| 0.63125 | 155.509 |
| 0.6319444444444444 | 132.814 |
| 0.6326388888888889 | 178.264 |
| 0.6333333333333333 | 360.221 |
| 0.6340277777777777 | 137.347 |
| 0.6347222222222222 | 141.884 |
| 0.6354166666666666 | 150.964 |
| 0.6361111111111112 | 146.423 |
| 0.6368055555555555 | 146.423 |
| 0.6375000000000001 | 141.884 |
| 0.6381944444444444 | 146.423 |
| 0.638888888888889 | 146.423 |
| 0.6395833333333333 | 150.964 |
| 0.6402777777777778 | 155.509 |
| 0.6409722222222222 | 160.056 |
| 0.6416666666666667 | 160.056 |
| 0.642361111111111 | 164.605 |
| 0.6430555555555556 | 164.605 |
| 0.6437499999999999 | 160.056 |
| 0.6444444444444445 | 155.509 |
| 0.6451388888888888 | 155.509 |
| 0.6458333333333334 | 155.509 |
| 0.6465277777777778 | 155.509 |
| 0.6472222222222223 | 173.709 |
| 0.6479166666666667 | 242.127 |
| 0.6486111111111111 | 164.605 |
| 0.6493055555555556 | 164.605 |
| 0.65 | 173.709 |
| 0.6506944444444445 | 342.162 |
| 0.6513888888888889 | 328.584 |
| 0.6520833333333333 | 283.156 |
| 0.6527777777777778 | 182.82 |
| 0.6534722222222222 | 287.709 |
| 0.6541666666666667 | 305.898 |
| 0.6548611111111111 | 310.44 |
| 0.6555555555555556 | 422.943 |
| 0.65625 | 414.035 |
| 0.6569444444444444 | 396.164 |
| 0.6576388888888889 | 387.202 |
| 0.6583333333333333 | 378.224 |
| 0.6590277777777778 | 378.224 |
| 0.6597222222222222 | 360.221 |
| 0.6604166666666667 | 351.198 |
| 0.6611111111111111 | 360.221 |
| 0.6618055555555555 | 360.221 |
| 0.6625 | 355.712 |
| 0.6631944444444444 | 346.682 |
| 0.6638888888888889 | 342.162 |
| 0.6645833333333333 | 333.113 |
| 0.6652777777777777 | 328.584 |
| 0.6659722222222222 | 328.584 |
| 0.6666666666666666 | 319.517 |
| 0.6673611111111111 | 314.98 |
| 0.6680555555555556 | 305.898 |
| 0.6687500000000001 | 305.898 |
| 0.6694444444444444 | 296.808 |
| 0.6701388888888888 | 292.259 |
| 0.6708333333333334 | 292.259 |
| 0.6715277777777778 | 269.49 |
| 0.6722222222222222 | 182.82 |
| 0.6729166666666666 | 83.205 |
| 0.6736111111111112 | 74.246 |
| 0.6743055555555556 | 83.205 |
| 0.6749999999999999 | 196.497 |
| 0.6756944444444444 | 69.775 |
| 0.6763888888888889 | 69.775 |
| 0.6770833333333334 | 74.246 |
| 0.6777777777777777 | 214.746 |
| 0.6784722222222223 | 219.309 |
| 0.6791666666666667 | 219.309 |
| 0.6798611111111111 | 182.82 |
| 0.6805555555555555 | 164.605 |
| 0.68125 | 74.246 |
| 0.6819444444444445 | 83.205 |
| 0.6826388888888889 | 110.201 |
| 0.6833333333333332 | 110.201 |
| 0.6840277777777778 | 83.205 |
| 0.6847222222222222 | 65.31 |
| 0.6854166666666667 | 65.31 |
| 0.686111111111111 | 119.235 |
| 0.6868055555555556 | 164.605 |
| 0.6875 | 150.964 |
| 0.6881944444444444 | 155.509 |
| 0.688888888888889 | 155.509 |
| 0.6895833333333333 | 146.423 |
| 0.6902777777777778 | 146.423 |
| 0.6909722222222222 | 146.423 |
| 0.6916666666666668 | 141.884 |
| 0.6923611111111111 | 128.284 |
| 0.6930555555555555 | 110.201 |
| 0.69375 | 83.205 |
| 0.6944444444444445 | 101.184 |
| 0.6951388888888889 | 87.692 |
| 0.6958333333333333 | 101.184 |
| 0.6965277777777777 | 105.69 |
| 0.6972222222222223 | 110.201 |
| 0.6979166666666666 | 87.692 |
| 0.6986111111111111 | 47.511 |
| 0.6993055555555556 | 47.511 |
| 0.7000000000000001 | 51.951 |
| 0.7006944444444444 | 83.205 |
| 0.7013888888888888 | 92.184 |
| 0.7020833333333334 | 83.205 |
| 0.7027777777777778 | 65.31 |
| 0.7034722222222222 | 65.31 |
| 0.7041666666666666 | 56.398 |
| 0.7048611111111112 | 60.85 |
| 0.7055555555555556 | 65.31 |
| 0.7062499999999999 | 69.775 |
| 0.7069444444444444 | 74.246 |
| 0.7076388888888889 | 74.246 |
| 0.7083333333333334 | 74.246 |
| 0.7090277777777777 | 69.775 |
| 0.7097222222222223 | 69.775 |
| 0.7104166666666667 | 65.31 |
| 0.7111111111111111 | 56.398 |
| 0.7118055555555555 | 56.398 |
| 0.7125 | 47.511 |
| 0.7131944444444445 | 43.079 |
| 0.7138888888888889 | 43.079 |
| 0.7145833333333332 | 43.079 |
| 0.7152777777777778 | 38.653 |
| 0.7159722222222222 | 38.653 |
| 0.7166666666666667 | 38.653 |
| 0.717361111111111 | 34.234 |
| 0.7180555555555556 | 29.823 |
| 0.71875 | 29.823 |
| 0.7194444444444444 | 25.419 |
| 0.720138888888889 | 21.024 |
| 0.7208333333333333 | 21.024 |
| 0.7215277777777778 | 21.024 |
| 0.7222222222222222 | 21.024 |
| 0.7229166666666668 | 16.636 |
| 0.7236111111111111 | 16.636 |
| 0.7243055555555555 | 16.636 |
| 0.725 | 12.257 |
| 0.7256944444444445 | 12.257 |
| 0.7263888888888889 | 12.257 |
| 0.7270833333333333 | 12.257 |
| 0.7277777777777777 | 12.257 |
| 0.7284722222222223 | 7.887 |
| 0.7291666666666666 | 7.887 |
| 0.7298611111111111 | 7.887 |
| 0.7305555555555556 | 7.887 |
| 0.7312500000000001 | 7.887 |
| 0.7319444444444444 | 7.887 |
| 0.7326388888888888 | 7.887 |
| 0.7333333333333334 | 7.887 |
| 0.7340277777777778 | 3.525 |
| 0.7347222222222222 | 3.525 |
| 0.7354166666666666 | 3.525 |
| 0.7361111111111112 | 3.525 |
| 0.7368055555555556 | 3.525 |
| 0.7374999999999999 | 3.525 |
| 0.7381944444444444 | 3.525 |
| 0.7388888888888889 | 3.525 |
| 0.7395833333333334 | 3.525 |
| 0.7402777777777777 | 0 |
| 0.7409722222222223 | 0 |
| 0.7416666666666667 | 0 |
| 0.7423611111111111 | 0 |
| 0.7430555555555555 | 0 |
| 0.74375 | 0 |
| 0.7444444444444445 | 0 |
| 0.7451388888888889 | 0 |
| 0.7458333333333332 | 0 |
| 0.7465277777777778 | 0 |
| 0.7472222222222222 | 0 |
| 0.7479166666666667 | 0 |
| 0.748611111111111 | 0 |
| 0.7493055555555556 | 0 |
| 0.75 | 0 |
| 0.7506944444444444 | 0 |
| 0.751388888888889 | 0 |
| 0.7520833333333333 | 0 |
| 0.7527777777777778 | 0 |
| 0.7534722222222222 | 0 |
| 0.7541666666666668 | 0 |
| 0.7548611111111111 | 0 |
| 0.7555555555555555 | 0 |
| 0.75625 | 0 |
| 0.7569444444444445 | 0 |
| 0.7576388888888889 | 0 |
| 0.7583333333333333 | 0 |
| 0.7590277777777777 | 0 |
| 0.7597222222222223 | 0 |
| 0.7604166666666666 | 0 |
| 0.7611111111111111 | 0 |
| 0.7618055555555556 | 0 |
| 0.7625000000000001 | 0 |
| 0.7631944444444444 | 0 |
| 0.7638888888888888 | 0 |
| 0.7645833333333334 | 0 |
| 0.7652777777777778 | 0 |
| 0.7659722222222222 | 0 |
| 0.7666666666666666 | 0 |
| 0.7673611111111112 | 0 |
| 0.7680555555555556 | 0 |
| 0.7687499999999999 | 0 |
| 0.7694444444444444 | 0 |
| 0.7701388888888889 | 0 |
| 0.7708333333333334 | 0 |
| 0.7715277777777777 | 0 |
| 0.7722222222222223 | 0 |
| 0.7729166666666667 | 0 |
| 0.7736111111111111 | 0 |
| 0.7743055555555555 | 0 |
| 0.775 | 0 |
| 0.7756944444444445 | 0 |
| 0.7763888888888889 | 0 |
| 0.7770833333333332 | 0 |
| 0.7777777777777778 | 0 |
| 0.7784722222222222 | 0 |
| 0.7791666666666667 | 0 |
| 0.779861111111111 | 0 |
| 0.7805555555555556 | 0 |
| 0.78125 | 0 |
| 0.7819444444444444 | 0 |
| 0.782638888888889 | 0 |
| 0.7833333333333333 | 0 |
| 0.7840277777777778 | 0 |
| 0.7847222222222222 | 0 |
| 0.7854166666666668 | 0 |
| 0.7861111111111111 | 0 |
| 0.7868055555555555 | 0 |
| 0.7875 | 0 |
| 0.7881944444444445 | 0 |
| 0.7888888888888889 | 0 |
| 0.7895833333333333 | 0 |
| 0.7902777777777777 | 0 |
| 0.7909722222222223 | 0 |
| 0.7916666666666666 | 0 |
| 0.7923611111111111 | 0 |
| 0.7930555555555556 | 0 |
| 0.7937500000000001 | 0 |
| 0.7944444444444444 | 0 |
| 0.7951388888888888 | 0 |
| 0.7958333333333334 | 0 |
| 0.7965277777777778 | 0 |
| 0.7972222222222222 | 0 |
| 0.7979166666666666 | 0 |
| 0.7986111111111112 | 0 |
| 0.7993055555555556 | 0 |
| 0.7999999999999999 | 0 |
| 0.8006944444444444 | 0 |
| 0.8013888888888889 | 0 |
| 0.8020833333333334 | 0 |
| 0.8027777777777777 | 0 |
| 0.8034722222222223 | 0 |
| 0.8041666666666667 | 0 |
| 0.8048611111111111 | 0 |
| 0.8055555555555555 | 0 |
| 0.80625 | 0 |
| 0.8069444444444445 | 0 |
| 0.8076388888888889 | 0 |
| 0.8083333333333332 | 0 |
| 0.8090277777777778 | 0 |
| 0.8097222222222222 | 0 |
| 0.8104166666666667 | 0 |
| 0.811111111111111 | 0 |
| 0.8118055555555556 | 0 |
| 0.8125 | 0 |
| 0.8131944444444444 | 0 |
| 0.813888888888889 | 0 |
| 0.8145833333333333 | 0 |
| 0.8152777777777778 | 0 |
| 0.8159722222222222 | 0 |
| 0.8166666666666668 | 0 |
| 0.8173611111111111 | 0 |
| 0.8180555555555555 | 0 |
| 0.81875 | 0 |
| 0.8194444444444445 | 0 |
| 0.8201388888888889 | 0 |
| 0.8208333333333333 | 0 |
| 0.8215277777777777 | 0 |
| 0.8222222222222223 | 0 |
| 0.8229166666666666 | 0 |
| 0.8236111111111111 | 0 |
| 0.8243055555555556 | 0 |
| 0.8250000000000001 | 0 |
| 0.8256944444444444 | 0 |
| 0.8263888888888888 | 0 |
| 0.8270833333333334 | 0 |
| 0.8277777777777778 | 0 |
| 0.8284722222222222 | 0 |
| 0.8291666666666666 | 0 |
| 0.8298611111111112 | 0 |
| 0.8305555555555556 | 0 |
| 0.8312499999999999 | 0 |
| 0.8319444444444444 | 0 |
| 0.8326388888888889 | 0 |
| 0.8333333333333334 | 0 |
| 0.8340277777777777 | 0 |
| 0.8347222222222223 | 0 |
| 0.8354166666666667 | 0 |
| 0.8361111111111111 | 0 |
| 0.8368055555555555 | 0 |
| 0.8375 | 0 |
| 0.8381944444444445 | 0 |
| 0.8388888888888889 | 0 |
| 0.8395833333333332 | 0 |
| 0.8402777777777778 | 0 |
| 0.8409722222222222 | 0 |
| 0.8416666666666667 | 0 |
| 0.842361111111111 | 0 |
| 0.8430555555555556 | 0 |
| 0.84375 | 0 |
| 0.8444444444444444 | 0 |
| 0.845138888888889 | 0 |
| 0.8458333333333333 | 0 |
| 0.8465277777777778 | 0 |
| 0.8472222222222222 | 0 |
| 0.8479166666666668 | 0 |
| 0.8486111111111111 | 0 |
| 0.8493055555555555 | 0 |
| 0.85 | 0 |
| 0.8506944444444445 | 0 |
| 0.8513888888888889 | 0 |
| 0.8520833333333333 | 0 |
| 0.8527777777777777 | 0 |
| 0.8534722222222223 | 0 |
| 0.8541666666666666 | 0 |
| 0.8548611111111111 | 0 |
| 0.8555555555555556 | 0 |
| 0.8562500000000001 | 0 |
| 0.8569444444444444 | 0 |
| 0.8576388888888888 | 0 |
| 0.8583333333333334 | 0 |
| 0.8590277777777778 | 0 |
| 0.8597222222222222 | 0 |
| 0.8604166666666666 | 0 |
| 0.8611111111111112 | 0 |
| 0.8618055555555556 | 0 |
| 0.8624999999999999 | 0 |
| 0.8631944444444444 | 0 |
| 0.8638888888888889 | 0 |
| 0.8645833333333334 | 0 |
| 0.8652777777777777 | 0 |
| 0.8659722222222223 | 0 |
| 0.8666666666666667 | 0 |
| 0.8673611111111111 | 0 |
| 0.8680555555555555 | 0 |
| 0.86875 | 0 |
| 0.8694444444444445 | 0 |
| 0.8701388888888889 | 0 |
| 0.8708333333333332 | 0 |
| 0.8715277777777778 | 0 |
| 0.8722222222222222 | 0 |
| 0.8729166666666667 | 0 |
| 0.873611111111111 | 0 |
| 0.8743055555555556 | 0 |
| 0.875 | 0 |
| 0.8756944444444444 | 0 |
| 0.876388888888889 | 0 |
| 0.8770833333333333 | 0 |
| 0.8777777777777778 | 0 |
| 0.8784722222222222 | 0 |
| 0.8791666666666668 | 0 |
| 0.8798611111111111 | 0 |
| 0.8805555555555555 | 0 |
| 0.88125 | 0 |
| 0.8819444444444445 | 0 |
| 0.8826388888888889 | 0 |
| 0.8833333333333333 | 0 |
| 0.8840277777777777 | 0 |
| 0.8847222222222223 | 0 |
| 0.8854166666666666 | 0 |
| 0.8861111111111111 | 0 |
| 0.8868055555555556 | 0 |
| 0.8875000000000001 | 0 |
| 0.8881944444444444 | 0 |
| 0.8888888888888888 | 0 |
| 0.8895833333333334 | 0 |
| 0.8902777777777778 | 0 |
| 0.8909722222222222 | 0 |
| 0.8916666666666666 | 0 |
| 0.8923611111111112 | 0 |
| 0.8930555555555556 | 0 |
| 0.8937499999999999 | 0 |
| 0.8944444444444444 | 0 |
| 0.8951388888888889 | 0 |
| 0.8958333333333334 | 0 |
| 0.8965277777777777 | 0 |
| 0.8972222222222223 | 0 |
| 0.8979166666666667 | 0 |
| 0.8986111111111111 | 0 |
| 0.8993055555555555 | 0 |
| 0.9 | 0 |
| 0.9006944444444445 | 0 |
| 0.9013888888888889 | 0 |
| 0.9020833333333332 | 0 |
| 0.9027777777777778 | 0 |
| 0.9034722222222222 | 0 |
| 0.9041666666666667 | 0 |
| 0.904861111111111 | 0 |
| 0.9055555555555556 | 0 |
| 0.90625 | 0 |
| 0.9069444444444444 | 0 |
| 0.907638888888889 | 0 |
| 0.9083333333333333 | 0 |
| 0.9090277777777778 | 0 |
| 0.9097222222222222 | 0 |
| 0.9104166666666668 | 0 |
| 0.9111111111111111 | 0 |
| 0.9118055555555555 | 0 |
| 0.9125 | 0 |
| 0.9131944444444445 | 0 |
| 0.9138888888888889 | 0 |
| 0.9145833333333333 | 0 |
| 0.9152777777777777 | 0 |
| 0.9159722222222223 | 0 |
| 0.9166666666666666 | 0 |
| 0.9173611111111111 | 0 |
| 0.9180555555555556 | 0 |
| 0.9187500000000001 | 0 |
| 0.9194444444444444 | 0 |
| 0.9201388888888888 | 0 |
| 0.9208333333333334 | 0 |
| 0.9215277777777778 | 0 |
| 0.9222222222222222 | 0 |
| 0.9229166666666666 | 0 |
| 0.9236111111111112 | 0 |
| 0.9243055555555556 | 0 |
| 0.9249999999999999 | 0 |
| 0.9256944444444444 | 0 |
| 0.9263888888888889 | 0 |
| 0.9270833333333334 | 0 |
| 0.9277777777777777 | 0 |
| 0.9284722222222223 | 0 |
| 0.9291666666666667 | 0 |
| 0.9298611111111111 | 0 |
| 0.9305555555555555 | 0 |
| 0.93125 | 0 |
| 0.9319444444444445 | 0 |
| 0.9326388888888889 | 0 |
| 0.9333333333333332 | 0 |
| 0.9340277777777778 | 0 |
| 0.9347222222222222 | 0 |
| 0.9354166666666667 | 0 |
| 0.936111111111111 | 0 |
| 0.9368055555555556 | 0 |
| 0.9375 | 0 |
| 0.9381944444444444 | 0 |
| 0.938888888888889 | 0 |
| 0.9395833333333333 | 0 |
| 0.9402777777777778 | 0 |
| 0.9409722222222222 | 0 |
| 0.9416666666666668 | 0 |
| 0.9423611111111111 | 0 |
| 0.9430555555555555 | 0 |
| 0.94375 | 0 |
| 0.9444444444444445 | 0 |
| 0.9451388888888889 | 0 |
| 0.9458333333333333 | 0 |
| 0.9465277777777777 | 0 |
| 0.9472222222222223 | 0 |
| 0.9479166666666666 | 0 |
| 0.9486111111111111 | 0 |
| 0.9493055555555556 | 0 |
| 0.9500000000000001 | 0 |
| 0.9506944444444444 | 0 |
| 0.9513888888888888 | 0 |
| 0.9520833333333334 | 0 |
| 0.9527777777777778 | 0 |
| 0.9534722222222222 | 0 |
| 0.9541666666666666 | 0 |
| 0.9548611111111112 | 0 |
| 0.9555555555555556 | 0 |
| 0.9562499999999999 | 0 |
| 0.9569444444444444 | 0 |
| 0.9576388888888889 | 0 |
| 0.9583333333333334 | 0 |
| 0.9590277777777777 | 0 |
| 0.9597222222222223 | 0 |
| 0.9604166666666667 | 0 |
| 0.9611111111111111 | 0 |
| 0.9618055555555555 | 0 |
| 0.9625 | 0 |
| 0.9631944444444445 | 0 |
| 0.9638888888888889 | 0 |
| 0.9645833333333332 | 0 |
| 0.9652777777777778 | 0 |
| 0.9659722222222222 | 0 |
| 0.9666666666666667 | 0 |
| 0.967361111111111 | 0 |
| 0.9680555555555556 | 0 |
| 0.96875 | 0 |
| 0.9694444444444444 | 0 |
| 0.970138888888889 | 0 |
| 0.9708333333333333 | 0 |
| 0.9715277777777778 | 0 |
| 0.9722222222222222 | 0 |
| 0.9729166666666668 | 0 |
| 0.9736111111111111 | 0 |
| 0.9743055555555555 | 0 |
| 0.975 | 0 |
| 0.9756944444444445 | 0 |
| 0.9763888888888889 | 0 |
| 0.9770833333333333 | 0 |
| 0.9777777777777777 | 0 |
| 0.9784722222222223 | 0 |
| 0.9791666666666666 | 0 |
| 0.9798611111111111 | 0 |
| 0.9805555555555556 | 0 |
| 0.9812500000000001 | 0 |
| 0.9819444444444444 | 0 |
| 0.9826388888888888 | 0 |
| 0.9833333333333334 | 0 |
| 0.9840277777777778 | 0 |
| 0.9847222222222222 | 0 |
| 0.9854166666666666 | 0 |
| 0.9861111111111112 | 0 |
| 0.9868055555555556 | 0 |
| 0.9874999999999999 | 0 |
| 0.9881944444444444 | 0 |
| 0.9888888888888889 | 0 |
| 0.9895833333333334 | 0 |
| 0.9902777777777777 | 0 |
| 0.9909722222222223 | 0 |
| 0.9916666666666667 | 0 |
| 0.9923611111111111 | 0 |
| 0.9930555555555555 | 0 |
| 0.99375 | 0 |
| 0.9944444444444445 | 0 |
| 0.9951388888888889 | 0 |
| 0.9958333333333332 | 0 |
| 0.9965277777777778 | 0 |
| 0.9972222222222222 | 0 |
| 0.9979166666666667 | 0 |
| 0.998611111111111 | 0 |
| 0.9993055555555556 | 0 |